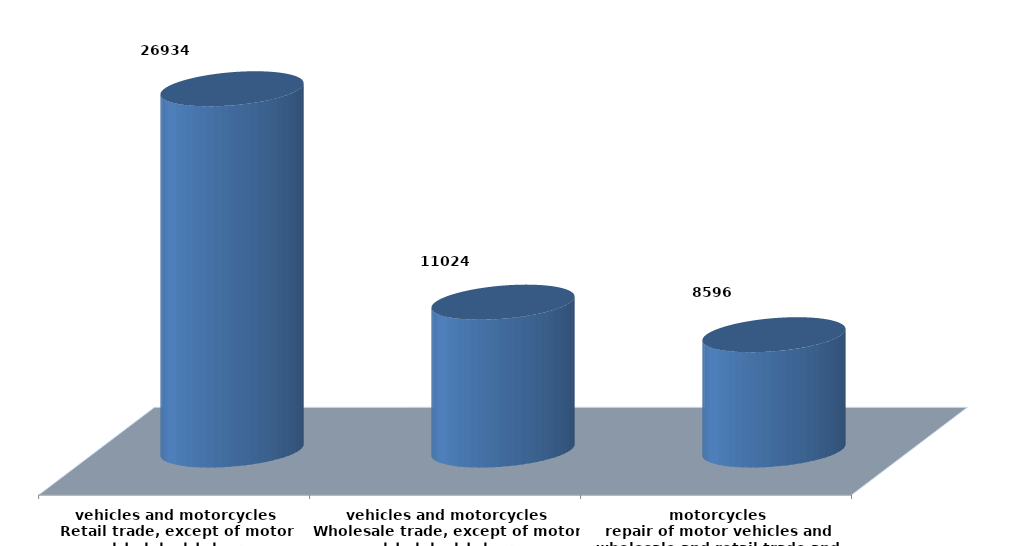
| Category | Series 0 |
|---|---|
| تجارة الجملة والتجزئة ،واصلاح المركبات ذات المحركات والدراجات النارية
wholesale and retail trade and repair of motor vehicles and motorcycles | 8595787 |
| تجارة الجملة ، باستثناء المركبات ذات المحركات والدراجات النارية
Wholesale trade, except of motor vehicles and motorcycles | 11023894 |
| تجارة التجزئة،باستثناء المركبات ذات المحركات والدراجات النارية
Retail trade, except of motor vehicles and motorcycles | 26934451 |